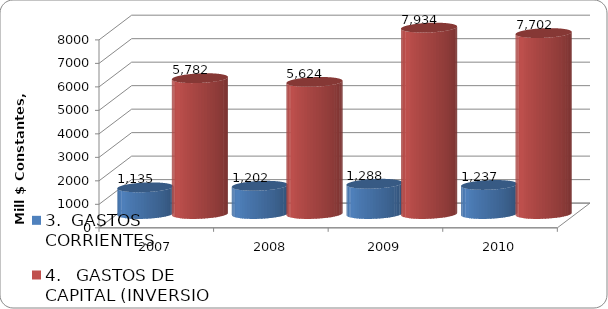
| Category | 3.  GASTOS CORRIENTES | 4.   GASTOS DE CAPITAL (INVERSION) |
|---|---|---|
| 2007 | 1135.314 | 5781.944 |
| 2008 | 1201.765 | 5623.673 |
| 2009 | 1287.562 | 7933.773 |
| 2010 | 1237 | 7702 |